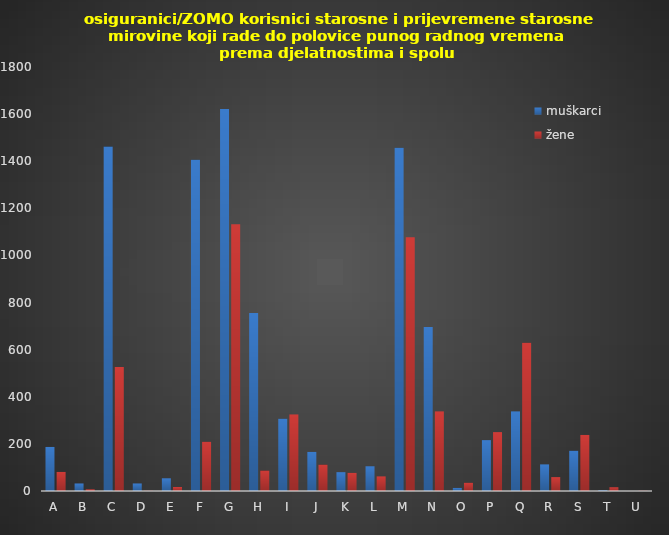
| Category | muškarci | žene |
|---|---|---|
| A | 187 | 81 |
| B | 32 | 7 |
| C | 1462 | 526 |
| D | 32 | 1 |
| E | 54 | 17 |
| F | 1406 | 209 |
| G | 1622 | 1132 |
| H | 756 | 87 |
| I | 307 | 325 |
| J | 166 | 112 |
| K | 80 | 77 |
| L | 105 | 62 |
| M | 1457 | 1077 |
| N | 696 | 338 |
| O | 13 | 35 |
| P | 216 | 250 |
| Q | 338 | 629 |
| R | 113 | 59 |
| S | 171 | 238 |
| T | 3 | 16 |
| U | 0 | 1 |